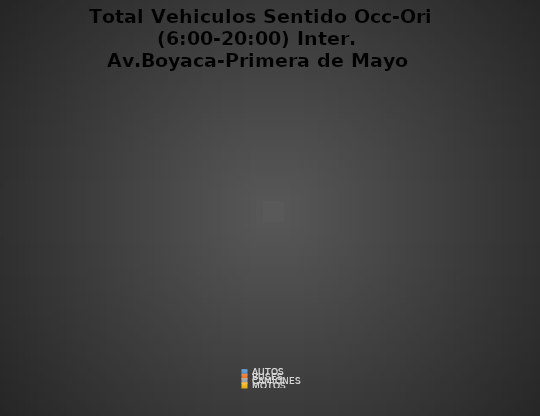
| Category | PORCENTAJE |
|---|---|
| AUTOS | 0 |
| BUSES | 0 |
| CAMIONES | 0 |
| MOTOS | 0 |